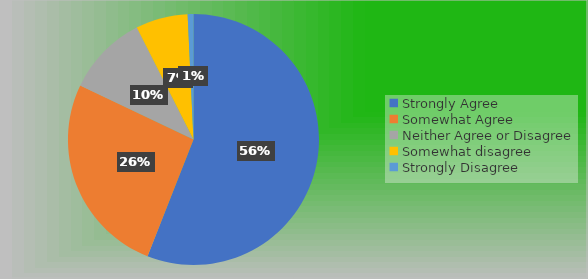
| Category | Series 0 |
|---|---|
| Strongly Agree | 75 |
| Somewhat Agree | 35 |
| Neither Agree or Disagree | 14 |
| Somewhat disagree | 9 |
| Strongly Disagree | 1 |